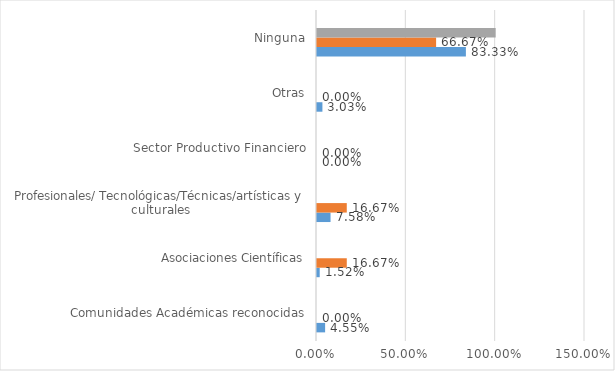
| Category | Series 0 | Series 1 | Series 2 | Series 3 |
|---|---|---|---|---|
| Comunidades Académicas reconocidas | 0.045 | 0 | 0 | 0 |
| Asociaciones Científicas | 0.015 | 0.167 | 0 | 0 |
| Profesionales/ Tecnológicas/Técnicas/artísticas y culturales | 0.076 | 0.167 | 0 | 0 |
| Sector Productivo Financiero | 0 | 0 | 0 | 0 |
| Otras | 0.03 | 0 | 0 | 0 |
| Ninguna | 0.833 | 0.667 | 1 | 0 |